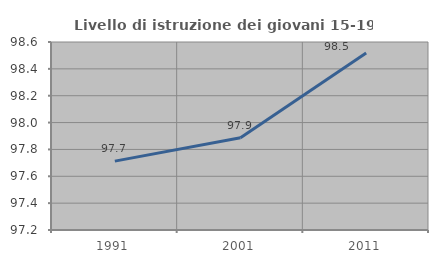
| Category | Livello di istruzione dei giovani 15-19 anni |
|---|---|
| 1991.0 | 97.713 |
| 2001.0 | 97.887 |
| 2011.0 | 98.517 |